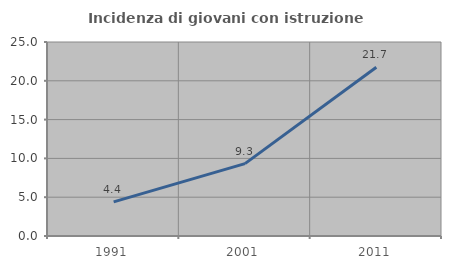
| Category | Incidenza di giovani con istruzione universitaria |
|---|---|
| 1991.0 | 4.39 |
| 2001.0 | 9.328 |
| 2011.0 | 21.739 |